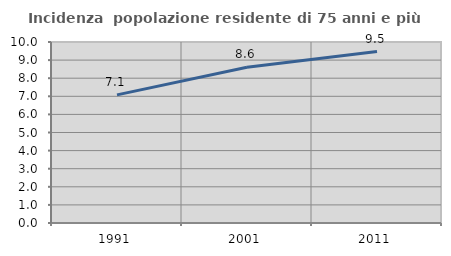
| Category | Incidenza  popolazione residente di 75 anni e più |
|---|---|
| 1991.0 | 7.079 |
| 2001.0 | 8.607 |
| 2011.0 | 9.474 |